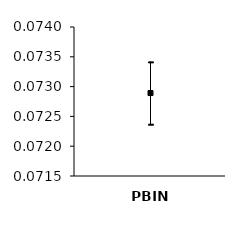
| Category | Series 0 | Series 1 | Series 2 |
|---|---|---|---|
| 0 | 0.073 | 0.072 | 0.073 |